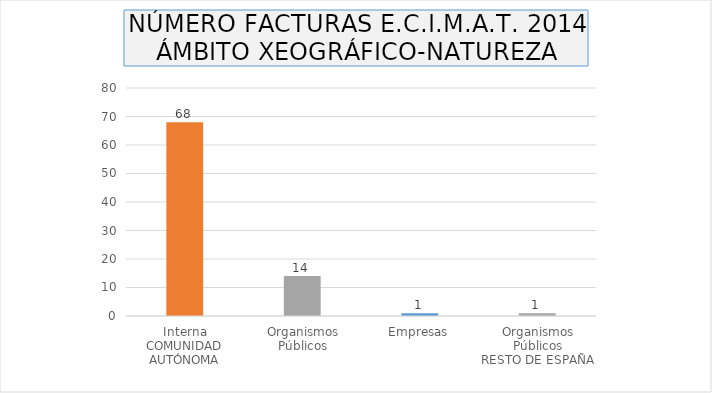
| Category | Series 0 |
|---|---|
| 0 | 68 |
| 1 | 14 |
| 2 | 1 |
| 3 | 1 |